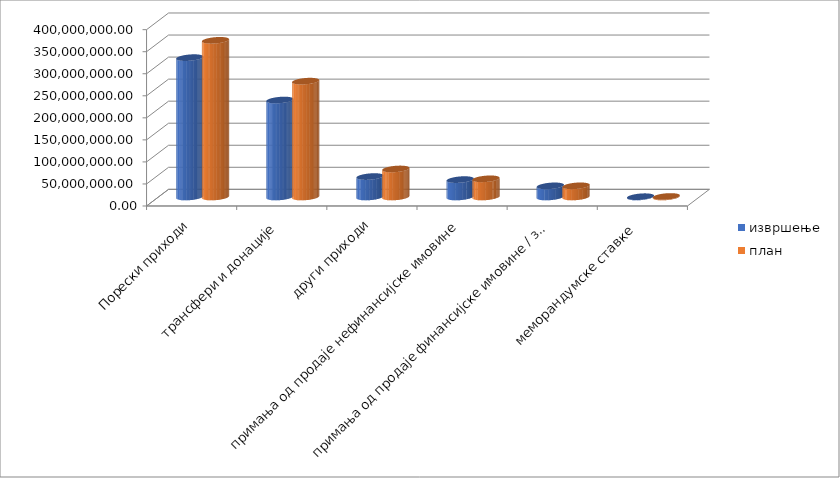
| Category | извршење | план |
|---|---|---|
| Порески приходи | 316126000 | 355430000 |
| трансфери и донације | 219968000 | 262797000 |
| други приходи | 46363000 | 63630000 |
| примања од продаје нефинансијске имовине | 39479000 | 41250000 |
| примања од продаје финансијске имовине / задуживања | 25257000 | 25376000 |
| меморандумске ставке  | 684000 | 1200000 |